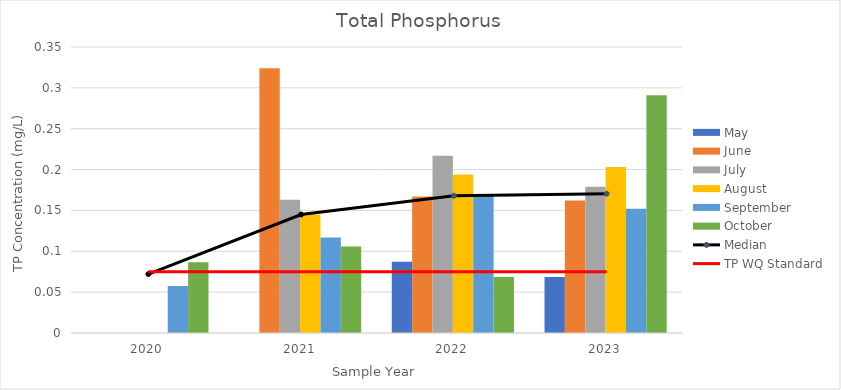
| Category | May | June | July | August | September | October |
|---|---|---|---|---|---|---|
| 2020.0 | 0 | 0 | 0 | 0 | 0.058 | 0.087 |
| 2021.0 | 0 | 0.324 | 0.163 | 0.145 | 0.117 | 0.106 |
| 2022.0 | 0.087 | 0.167 | 0.217 | 0.194 | 0.169 | 0.069 |
| 2023.0 | 0.069 | 0.162 | 0.179 | 0.203 | 0.152 | 0.291 |